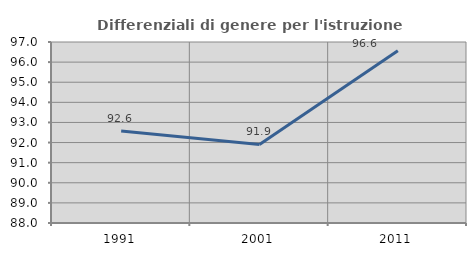
| Category | Differenziali di genere per l'istruzione superiore |
|---|---|
| 1991.0 | 92.571 |
| 2001.0 | 91.904 |
| 2011.0 | 96.565 |